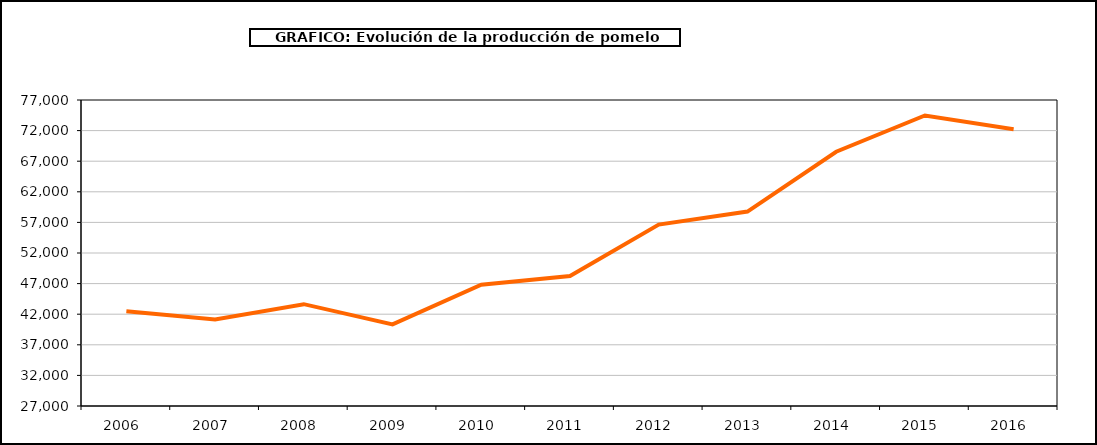
| Category | producción |
|---|---|
| 2006.0 | 42467 |
| 2007.0 | 41120 |
| 2008.0 | 43639 |
| 2009.0 | 40339 |
| 2010.0 | 46824 |
| 2011.0 | 48231 |
| 2012.0 | 56634 |
| 2013.0 | 58770 |
| 2014.0 | 68545 |
| 2015.0 | 74470 |
| 2016.0 | 72236 |